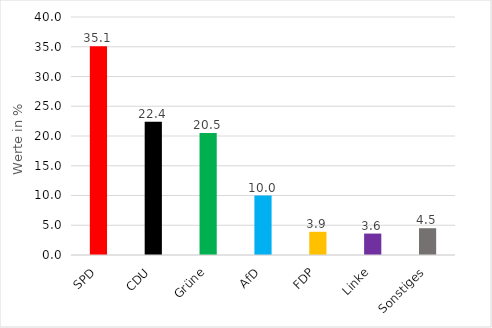
| Category | Series 0 |
|---|---|
| SPD | 35.1 |
| CDU | 22.4 |
| Grüne | 20.5 |
| AfD | 10 |
| FDP | 3.9 |
| Linke | 3.6 |
| Sonstiges | 4.5 |